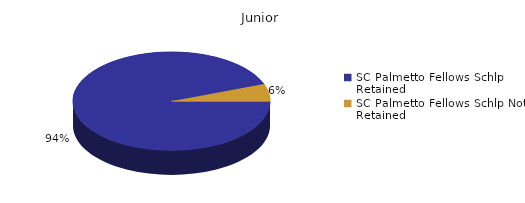
| Category | Junior |
|---|---|
| SC Palmetto Fellows Schlp Retained  | 453 |
| SC Palmetto Fellows Schlp Not Retained  | 27 |